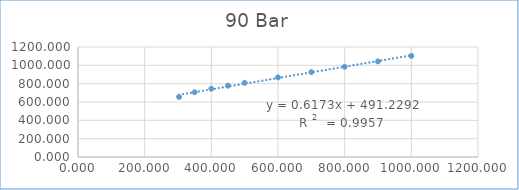
| Category | Series 0 |
|---|---|
| 303.3 | 655.256 |
| 350.0 | 706.474 |
| 400.0 | 745.055 |
| 450.0 | 778.309 |
| 500.0 | 809.221 |
| 600.0 | 868.156 |
| 700.0 | 925.968 |
| 800.0 | 984.018 |
| 900.0 | 1042.929 |
| 1000.0 | 1102.891 |